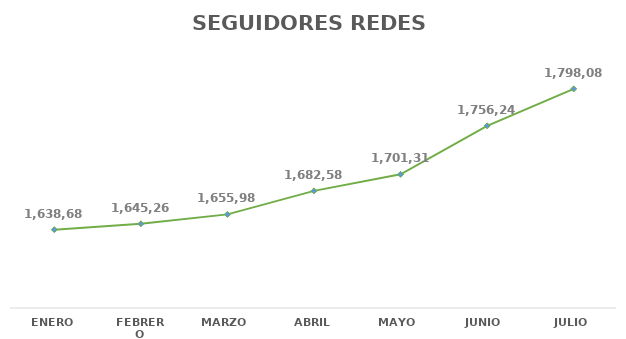
| Category | Series 0 |
|---|---|
| ENERO | 1638688 |
| FEBRERO | 1645263 |
| MARZO  | 1655986 |
| ABRIL | 1682584 |
| MAYO  | 1701312 |
| JUNIO  | 1756243 |
| JULIO | 1798087 |